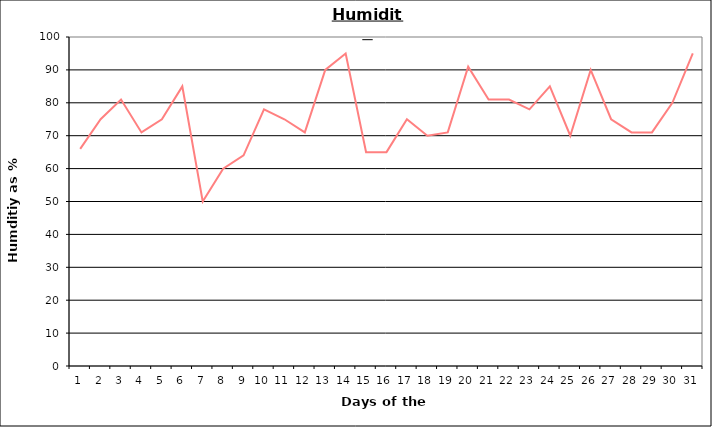
| Category | Series 0 |
|---|---|
| 0 | 66 |
| 1 | 75 |
| 2 | 81 |
| 3 | 71 |
| 4 | 75 |
| 5 | 85 |
| 6 | 50 |
| 7 | 60 |
| 8 | 64 |
| 9 | 78 |
| 10 | 75 |
| 11 | 71 |
| 12 | 90 |
| 13 | 95 |
| 14 | 65 |
| 15 | 65 |
| 16 | 75 |
| 17 | 70 |
| 18 | 71 |
| 19 | 91 |
| 20 | 81 |
| 21 | 81 |
| 22 | 78 |
| 23 | 85 |
| 24 | 70 |
| 25 | 90 |
| 26 | 75 |
| 27 | 71 |
| 28 | 71 |
| 29 | 80 |
| 30 | 95 |